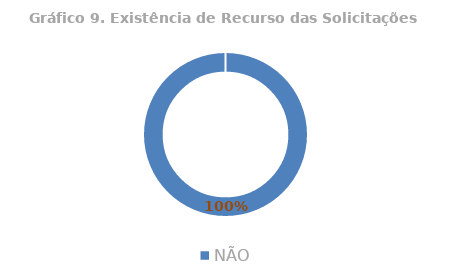
| Category | Total |
|---|---|
| NÃO | 1 |